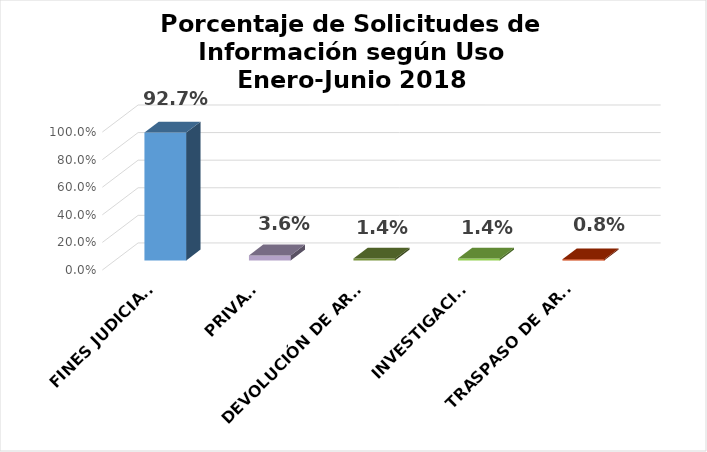
| Category | Series 0 |
|---|---|
| FINES JUDICIALES | 0.927 |
| PRIVADO | 0.036 |
| DEVOLUCIÓN DE ARMAS | 0.014 |
| INVESTIGACIÓN | 0.014 |
| TRASPASO DE ARMAS | 0.008 |